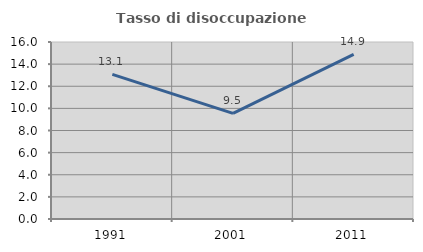
| Category | Tasso di disoccupazione giovanile  |
|---|---|
| 1991.0 | 13.067 |
| 2001.0 | 9.547 |
| 2011.0 | 14.888 |